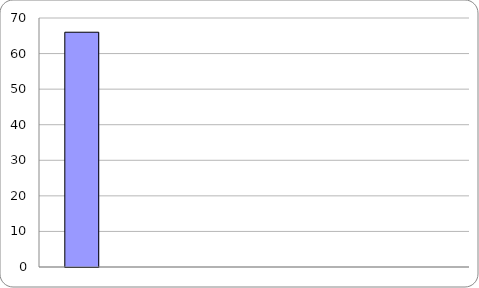
| Category | Score |
|---|---|
|  | 66 |
|  | 0 |
|  | 0 |
|  | 0 |
|  | 0 |